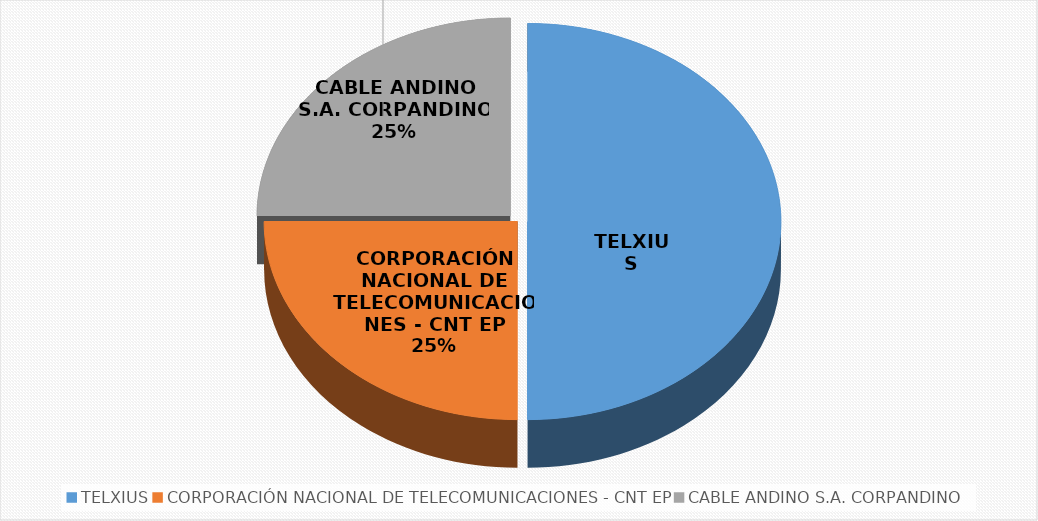
| Category | Series 0 |
|---|---|
| TELXIUS | 6 |
| CORPORACIÓN NACIONAL DE TELECOMUNICACIONES - CNT EP | 3 |
| CABLE ANDINO S.A. CORPANDINO | 3 |